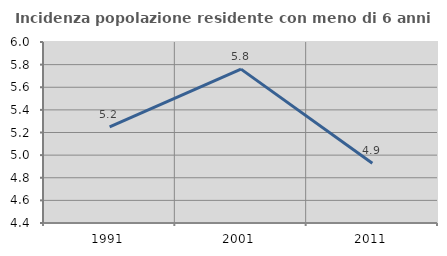
| Category | Incidenza popolazione residente con meno di 6 anni |
|---|---|
| 1991.0 | 5.249 |
| 2001.0 | 5.76 |
| 2011.0 | 4.929 |